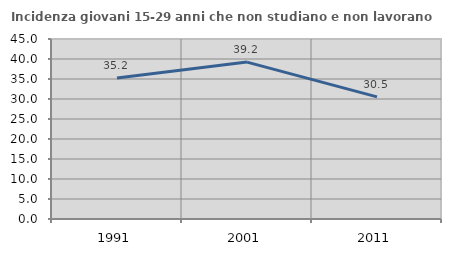
| Category | Incidenza giovani 15-29 anni che non studiano e non lavorano  |
|---|---|
| 1991.0 | 35.227 |
| 2001.0 | 39.222 |
| 2011.0 | 30.519 |